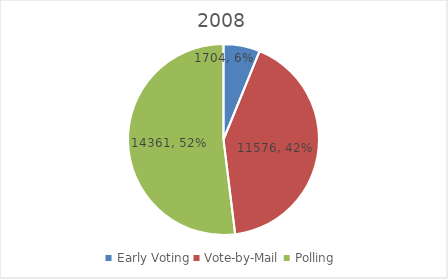
| Category | Series 0 |
|---|---|
| Early Voting | 1704 |
| Vote-by-Mail | 11576 |
| Polling | 14361 |